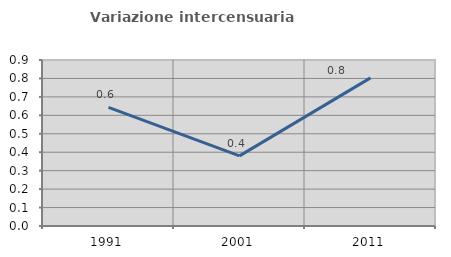
| Category | Variazione intercensuaria annua |
|---|---|
| 1991.0 | 0.643 |
| 2001.0 | 0.38 |
| 2011.0 | 0.803 |